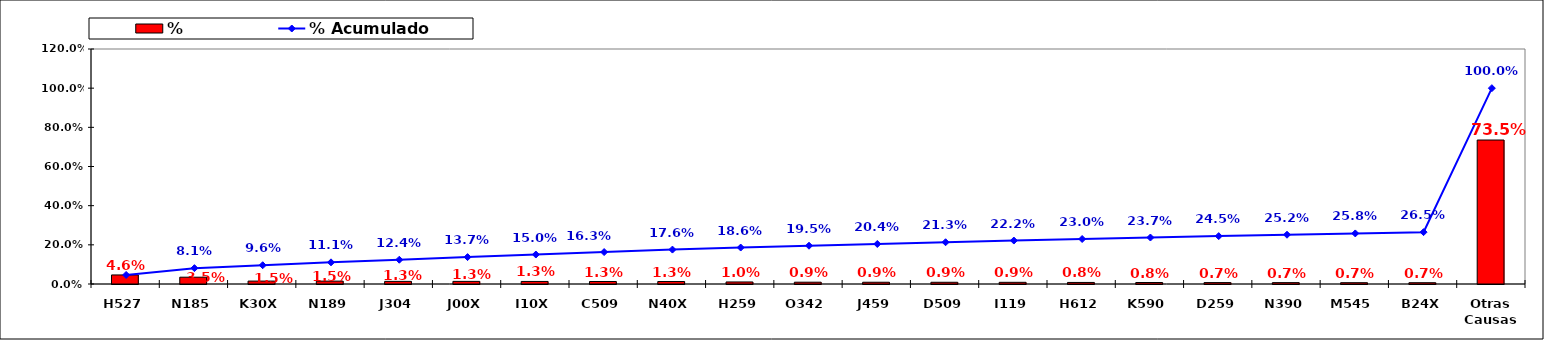
| Category | % |
|---|---|
| H527 | 0.046 |
| N185 | 0.035 |
| K30X | 0.015 |
| N189 | 0.015 |
| J304 | 0.013 |
| J00X | 0.013 |
| I10X | 0.013 |
| C509 | 0.013 |
| N40X | 0.013 |
| H259 | 0.01 |
| O342 | 0.009 |
| J459 | 0.009 |
| D509 | 0.009 |
| I119 | 0.009 |
| H612 | 0.008 |
| K590 | 0.008 |
| D259 | 0.007 |
| N390 | 0.007 |
| M545 | 0.007 |
| B24X | 0.007 |
| Otras Causas | 0.735 |